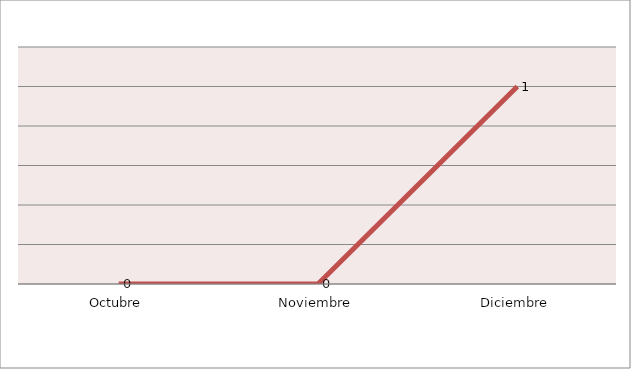
| Category | Series 0 |
|---|---|
| Octubre | 0 |
| Noviembre | 0 |
| Diciembre | 1 |